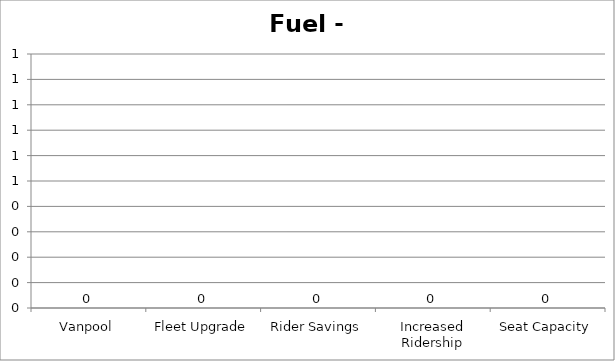
| Category | Fuel - GGE |
|---|---|
| Vanpool | 0 |
| Fleet Upgrade | 0 |
| Rider Savings | 0 |
| Increased Ridership | 0 |
| Seat Capacity | 0 |